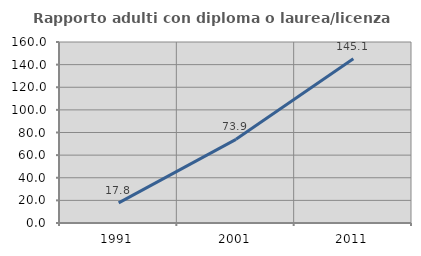
| Category | Rapporto adulti con diploma o laurea/licenza media  |
|---|---|
| 1991.0 | 17.808 |
| 2001.0 | 73.937 |
| 2011.0 | 145.134 |